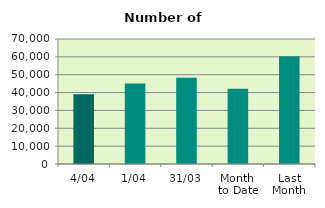
| Category | Series 0 |
|---|---|
| 4/04 | 39076 |
| 1/04 | 45148 |
| 31/03 | 48304 |
| Month 
to Date | 42112 |
| Last
Month | 60380.087 |